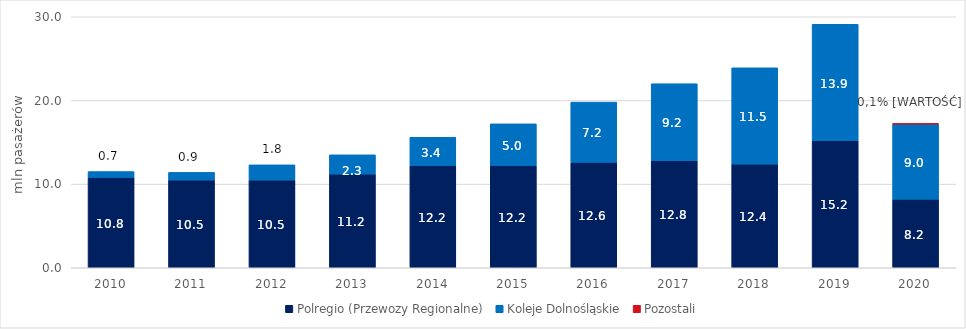
| Category | Polregio (Przewozy Regionalne) | Koleje Dolnośląskie | Pozostali |
|---|---|---|---|
| 2010 | 10.8 | 0.7 | 0 |
| 2011 | 10.5 | 0.9 | 0 |
| 2012 | 10.5 | 1.8 | 0 |
| 2013 | 11.2 | 2.3 | 0 |
| 2014 | 12.2 | 3.4 | 0 |
| 2015 | 12.2 | 5 | 0 |
| 2016 | 12.6 | 7.2 | 0 |
| 2017 | 12.8 | 9.2 | 0 |
| 2018 | 12.4 | 11.5 | 0 |
| 2019 | 15.2 | 13.9 | 0 |
| 2020 | 8.2 | 9 | 0.01 |